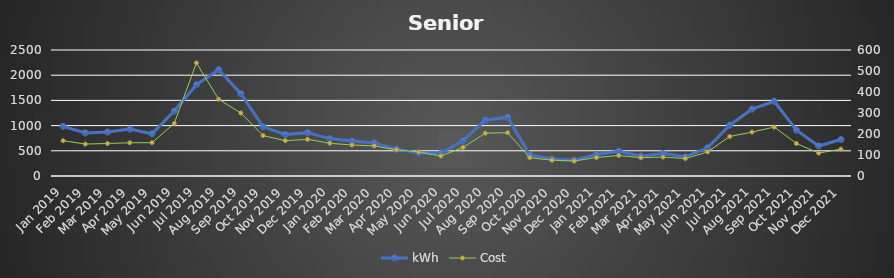
| Category | kWh |
|---|---|
| Jan 2019 | 985 |
| Feb 2019 | 855 |
| Mar 2019 | 871 |
| Apr 2019 | 930 |
| May 2019 | 838 |
| Jun 2019 | 1289 |
| Jul 2019 | 1811 |
| Aug 2019 | 2108 |
| Sep 2019 | 1632 |
| Oct 2019 | 975 |
| Nov 2019 | 823 |
| Dec 2019 | 860 |
| Jan 2020 | 742 |
| Feb 2020 | 694 |
| Mar 2020 | 657 |
| Apr 2020 | 533 |
| May 2020 | 459 |
| Jun 2020 | 453 |
| Jul 2020 | 700 |
| Aug 2020 | 1107 |
| Sep 2020 | 1166 |
| Oct 2020 | 417 |
| Nov 2020 | 338 |
| Dec 2020 | 314 |
| Jan 2021 | 426 |
| Feb 2021 | 489 |
| Mar 2021 | 394 |
| Apr 2021 | 448 |
| May 2021 | 381 |
| Jun 2021 | 560 |
| Jul 2021 | 1009 |
| Aug 2021 | 1326 |
| Sep 2021 | 1483 |
| Oct 2021 | 908 |
| Nov 2021 | 595 |
| Dec 2021 | 723 |